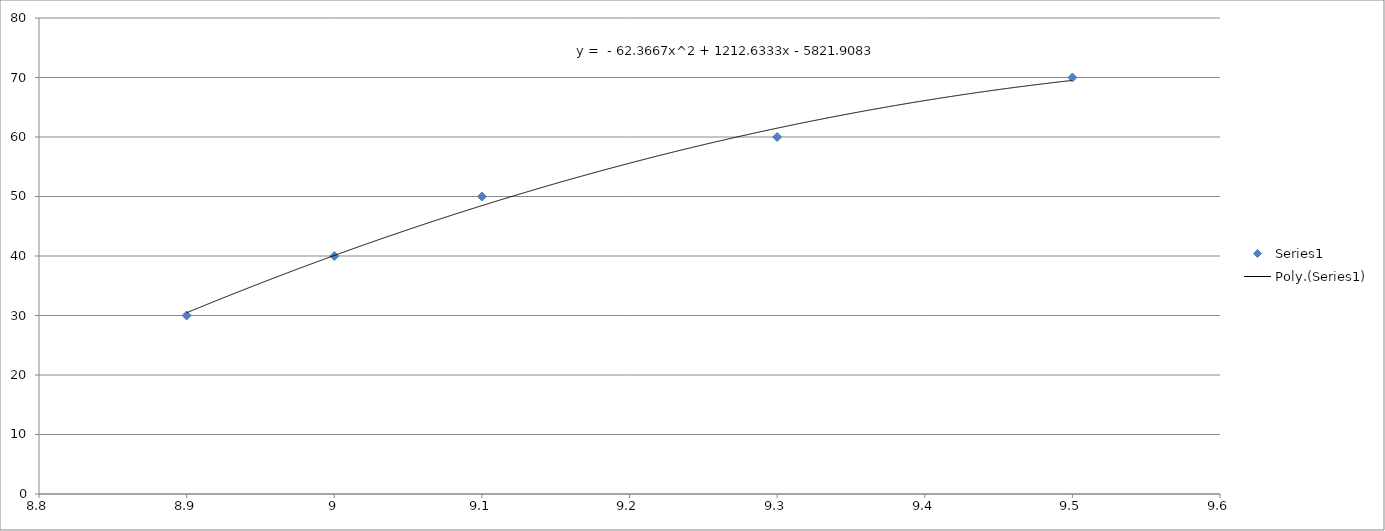
| Category | Series 0 |
|---|---|
| 8.9 | 30 |
| 9.0 | 40 |
| 9.1 | 50 |
| 9.3 | 60 |
| 9.5 | 70 |